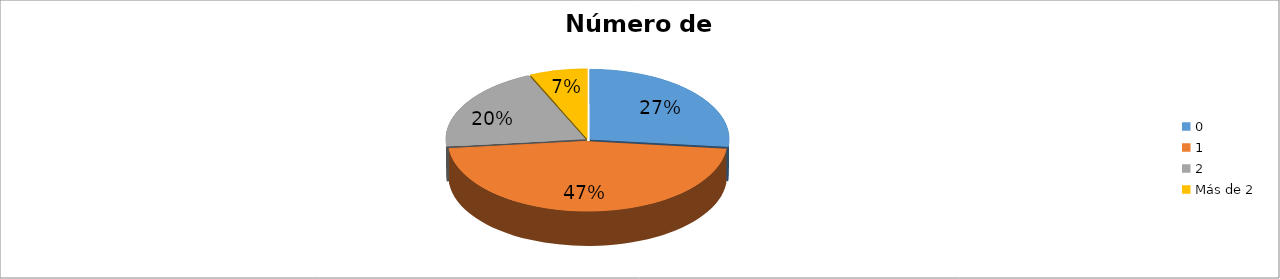
| Category | Series 0 |
|---|---|
| 0 | 0.267 |
| 1 | 0.467 |
| 2 | 0.2 |
| Más de 2 | 0.067 |